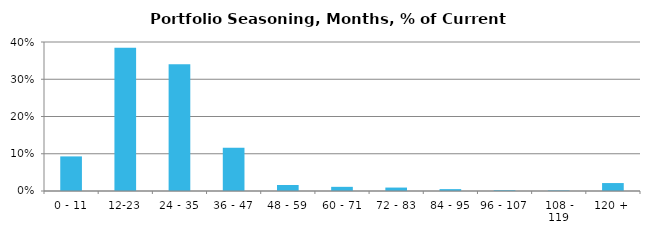
| Category | Series 0 |
|---|---|
| 0 - 11 | 0.093 |
| 12-23 | 0.385 |
| 24 - 35 | 0.34 |
| 36 - 47 | 0.116 |
| 48 - 59 | 0.016 |
| 60 - 71 | 0.011 |
| 72 - 83 | 0.009 |
| 84 - 95 | 0.005 |
| 96 - 107 | 0.002 |
| 108 - 119 | 0.001 |
| 120 + | 0.021 |